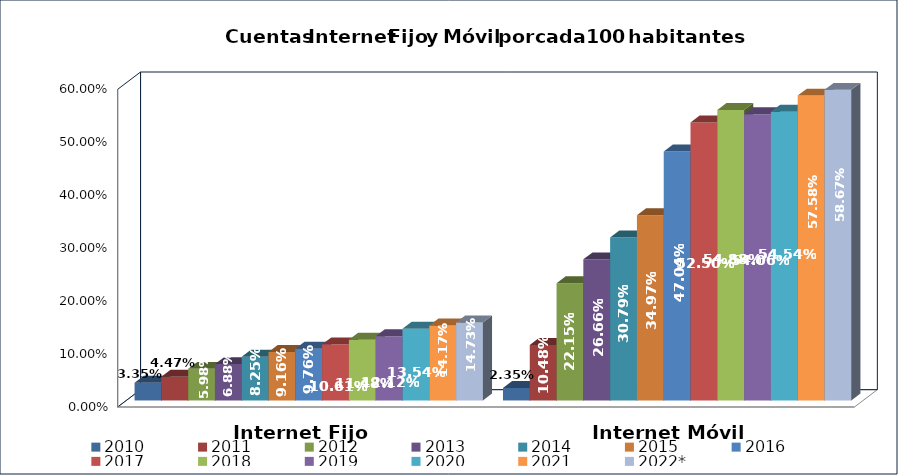
| Category | 2010 | 2011 | 2012 | 2013 | 2014 | 2015 | 2016 | 2017 | 2018 | 2019 | 2020 | 2021 | 2022* |
|---|---|---|---|---|---|---|---|---|---|---|---|---|---|
| Internet Fijo | 0.033 | 0.045 | 0.06 | 0.069 | 0.083 | 0.092 | 0.098 | 0.106 | 0.115 | 0.121 | 0.135 | 0.142 | 0.147 |
| Internet Móvil | 0.024 | 0.105 | 0.222 | 0.267 | 0.308 | 0.35 | 0.47 | 0.525 | 0.549 | 0.541 | 0.545 | 0.576 | 0.587 |